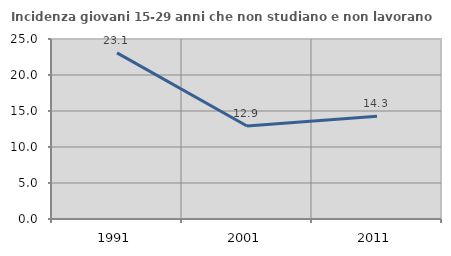
| Category | Incidenza giovani 15-29 anni che non studiano e non lavorano  |
|---|---|
| 1991.0 | 23.077 |
| 2001.0 | 12.924 |
| 2011.0 | 14.286 |